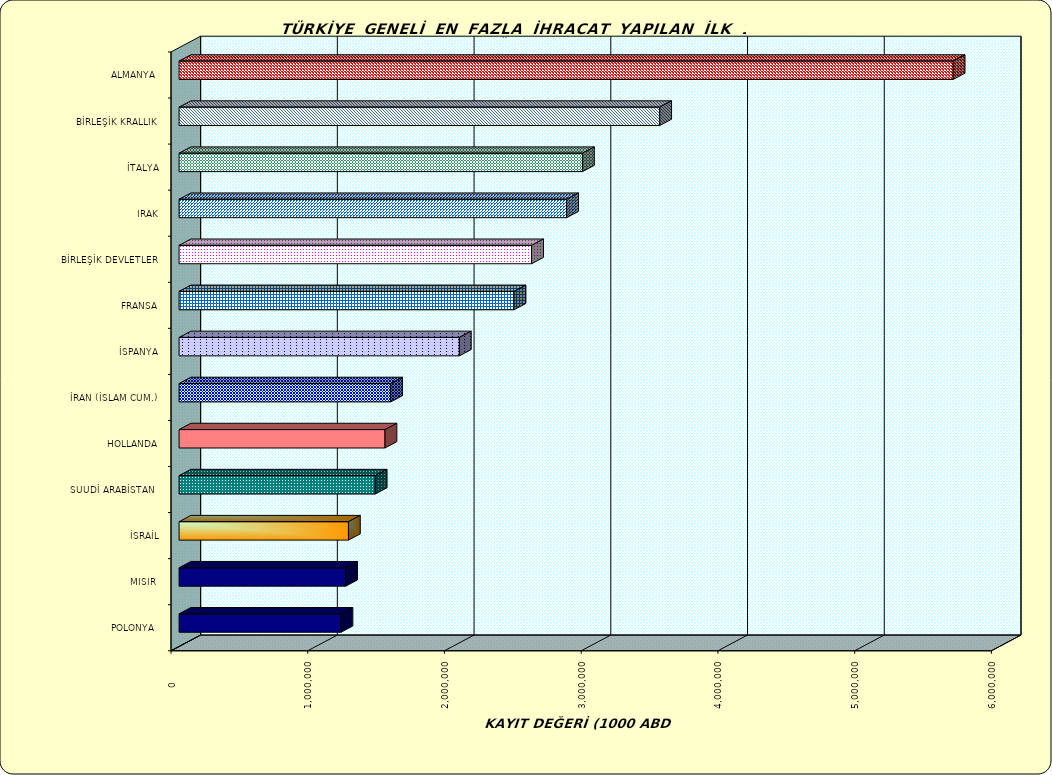
| Category | Series 0 |
|---|---|
| ALMANYA  | 5661319.442 |
| BİRLEŞİK KRALLIK | 3515268.321 |
| İTALYA | 2950652.54 |
| IRAK | 2834418.164 |
| BİRLEŞİK DEVLETLER | 2578312.844 |
| FRANSA | 2449882.549 |
| İSPANYA | 2049947.404 |
| İRAN (İSLAM CUM.) | 1547603.849 |
| HOLLANDA | 1505962.968 |
| SUUDİ ARABİSTAN  | 1434500.677 |
| İSRAİL | 1238631.088 |
| MISIR  | 1218321.817 |
| POLONYA  | 1184280.254 |